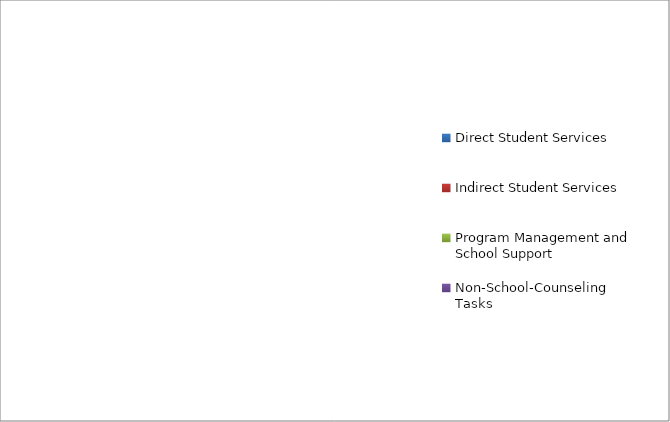
| Category | Series 0 |
|---|---|
| Direct Student Services | 0 |
| Indirect Student Services | 0 |
| Program Management and School Support | 0 |
| Non-School-Counseling Tasks | 0 |